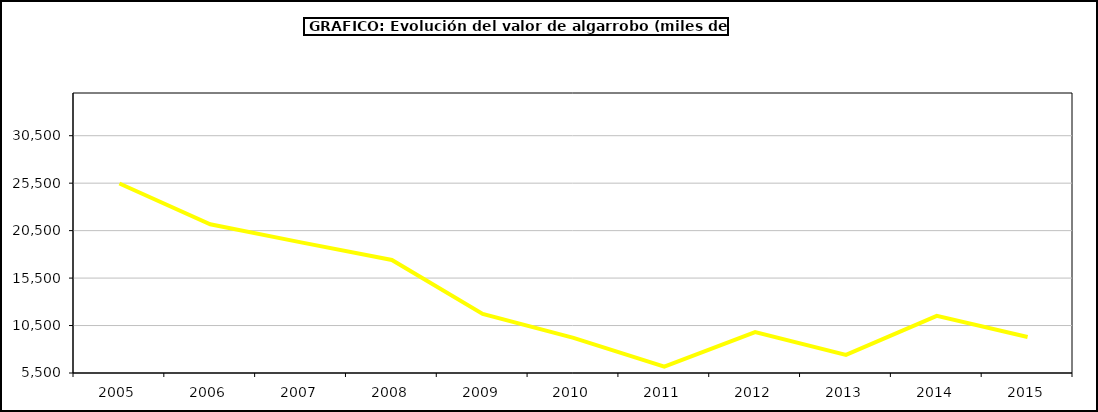
| Category | producción |
|---|---|
| 2005.0 | 25460.226 |
| 2006.0 | 21170.578 |
| 2007.0 | 19261.476 |
| 2008.0 | 17411.688 |
| 2009.0 | 11720.401 |
| 2010.0 | 9197.132 |
| 2011.0 | 6163.828 |
| 2012.0 | 9804.883 |
| 2013.0 | 7410.909 |
| 2014.0 | 11518 |
| 2015.0 | 9297 |